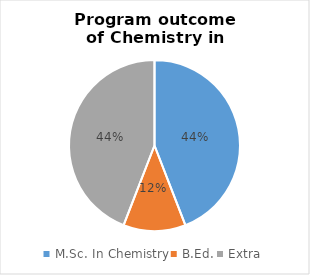
| Category | Series 0 |
|---|---|
| M.Sc. In Chemistry | 15 |
| B.Ed. | 4 |
| Extra | 15 |